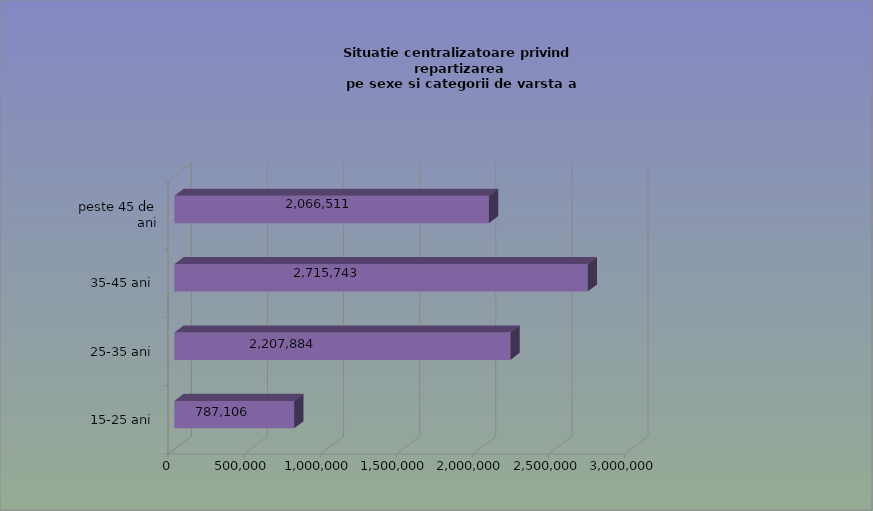
| Category | 15-25 ani 25-35 ani 35-45 ani peste 45 de ani |
|---|---|
| 15-25 ani | 787106 |
| 25-35 ani | 2207884 |
| 35-45 ani | 2715743 |
| peste 45 de ani | 2066511 |